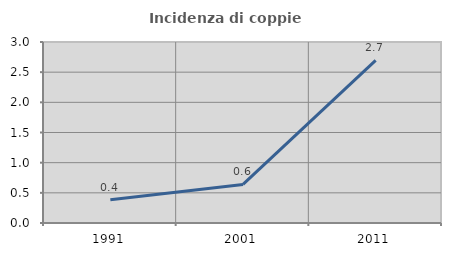
| Category | Incidenza di coppie miste |
|---|---|
| 1991.0 | 0.386 |
| 2001.0 | 0.64 |
| 2011.0 | 2.696 |